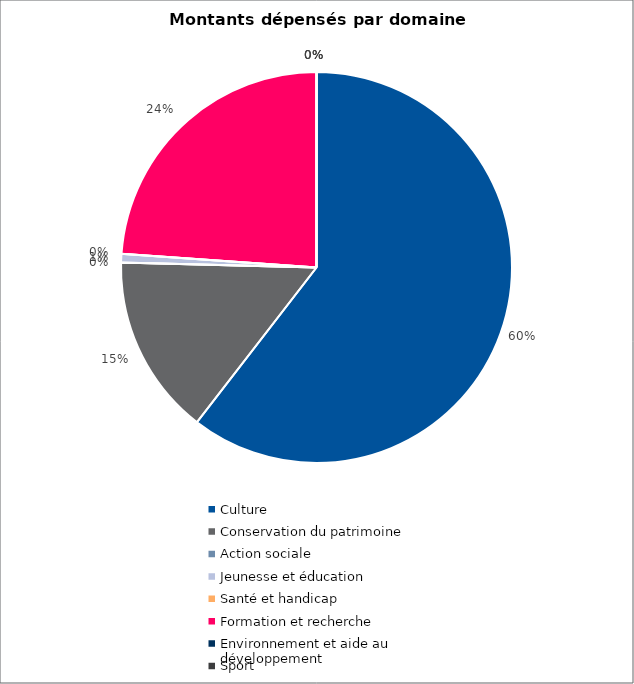
| Category | Series 0 |
|---|---|
| Culture | 202500 |
| Conservation du patrimoine | 50000 |
| Action sociale | 0 |
| Jeunesse et éducation | 2391 |
| Santé et handicap | 0 |
| Formation et recherche | 80000 |
| Environnement et aide au
développement | 0 |
| Sport | 0 |
| Autres projets d’utilité publique | 0 |